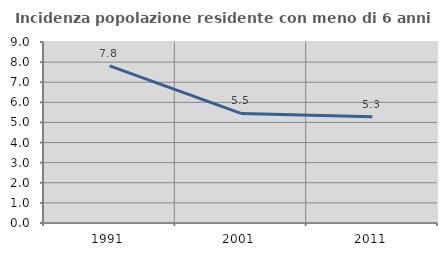
| Category | Incidenza popolazione residente con meno di 6 anni |
|---|---|
| 1991.0 | 7.812 |
| 2001.0 | 5.451 |
| 2011.0 | 5.289 |